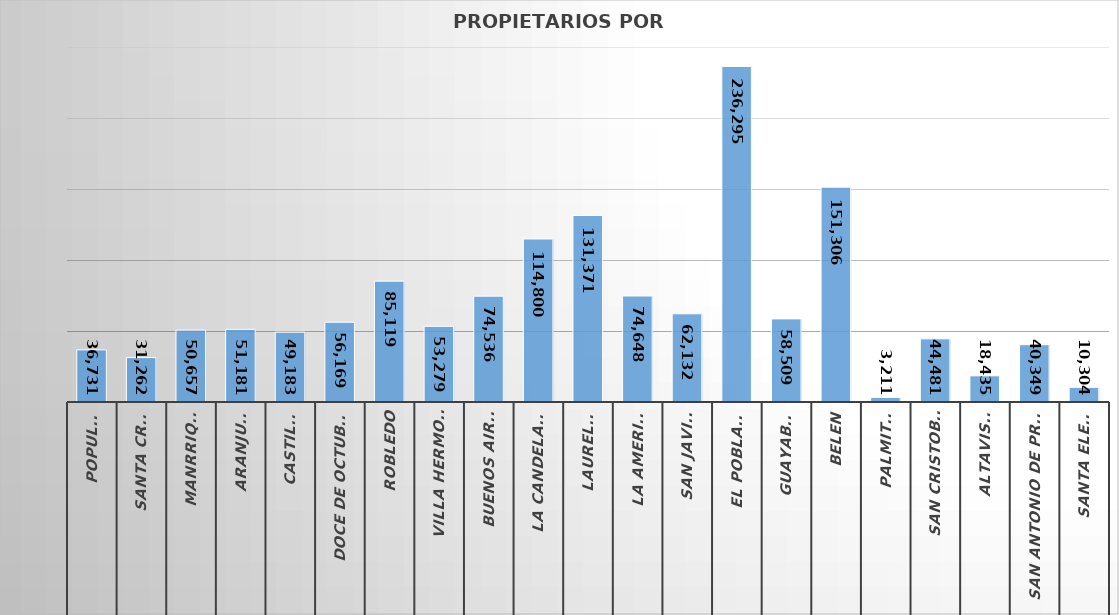
| Category | CuentaDeDocumento |
|---|---|
| 0 | 36731 |
| 1 | 31262 |
| 2 | 50657 |
| 3 | 51181 |
| 4 | 49183 |
| 5 | 56169 |
| 6 | 85119 |
| 7 | 53279 |
| 8 | 74536 |
| 9 | 114800 |
| 10 | 131371 |
| 11 | 74648 |
| 12 | 62132 |
| 13 | 236295 |
| 14 | 58509 |
| 15 | 151306 |
| 16 | 3211 |
| 17 | 44481 |
| 18 | 18435 |
| 19 | 40349 |
| 20 | 10304 |